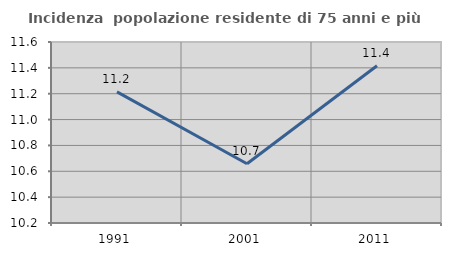
| Category | Incidenza  popolazione residente di 75 anni e più |
|---|---|
| 1991.0 | 11.215 |
| 2001.0 | 10.658 |
| 2011.0 | 11.416 |